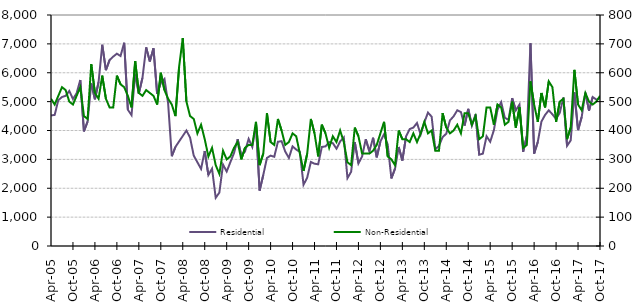
| Category | Residential |
|---|---|
| 2005-04-01 | 4520 |
| 2005-05-01 | 4540 |
| 2005-06-01 | 5050 |
| 2005-07-01 | 5160 |
| 2005-08-01 | 5200 |
| 2005-09-01 | 5370 |
| 2005-10-01 | 5090 |
| 2005-11-01 | 5290 |
| 2005-12-01 | 5750 |
| 2006-01-01 | 3970 |
| 2006-02-01 | 4310 |
| 2006-03-01 | 5630 |
| 2006-04-01 | 5080 |
| 2006-05-01 | 5680 |
| 2006-06-01 | 6970 |
| 2006-07-01 | 6090 |
| 2006-08-01 | 6440 |
| 2006-09-01 | 6560 |
| 2006-10-01 | 6660 |
| 2006-11-01 | 6580 |
| 2006-12-01 | 7040 |
| 2007-01-01 | 4720 |
| 2007-02-01 | 4530 |
| 2007-03-01 | 5940 |
| 2007-04-01 | 5280 |
| 2007-05-01 | 5830 |
| 2007-06-01 | 6880 |
| 2007-07-01 | 6390 |
| 2007-08-01 | 6850 |
| 2007-09-01 | 5270 |
| 2007-10-01 | 5660 |
| 2007-11-01 | 5790 |
| 2007-12-01 | 4940 |
| 2008-01-01 | 3110 |
| 2008-02-01 | 3430 |
| 2008-03-01 | 3620 |
| 2008-04-01 | 3810 |
| 2008-05-01 | 4000 |
| 2008-06-01 | 3750 |
| 2008-07-01 | 3130 |
| 2008-08-01 | 2900 |
| 2008-09-01 | 2670 |
| 2008-10-01 | 3290 |
| 2008-11-01 | 2460 |
| 2008-12-01 | 2680 |
| 2009-01-01 | 1670 |
| 2009-02-01 | 1850 |
| 2009-03-01 | 2820 |
| 2009-04-01 | 2580 |
| 2009-05-01 | 2900 |
| 2009-06-01 | 3220 |
| 2009-07-01 | 3700 |
| 2009-08-01 | 3130 |
| 2009-09-01 | 3270 |
| 2009-10-01 | 3710 |
| 2009-11-01 | 3430 |
| 2009-12-01 | 4210 |
| 2010-01-01 | 1920 |
| 2010-02-01 | 2460 |
| 2010-03-01 | 3050 |
| 2010-04-01 | 3130 |
| 2010-05-01 | 3090 |
| 2010-06-01 | 3610 |
| 2010-07-01 | 3630 |
| 2010-08-01 | 3270 |
| 2010-09-01 | 3050 |
| 2010-10-01 | 3450 |
| 2010-11-01 | 3340 |
| 2010-12-01 | 3260 |
| 2011-01-01 | 2120 |
| 2011-02-01 | 2370 |
| 2011-03-01 | 2910 |
| 2011-04-01 | 2850 |
| 2011-05-01 | 2830 |
| 2011-06-01 | 3430 |
| 2011-07-01 | 3450 |
| 2011-08-01 | 3600 |
| 2011-09-01 | 3560 |
| 2011-10-01 | 3370 |
| 2011-11-01 | 3620 |
| 2011-12-01 | 3760 |
| 2012-01-01 | 2350 |
| 2012-02-01 | 2570 |
| 2012-03-01 | 3600 |
| 2012-04-01 | 2860 |
| 2012-05-01 | 3100 |
| 2012-06-01 | 3700 |
| 2012-07-01 | 3280 |
| 2012-08-01 | 3750 |
| 2012-09-01 | 3070 |
| 2012-10-01 | 3620 |
| 2012-11-01 | 3870 |
| 2012-12-01 | 3510 |
| 2013-01-01 | 2340 |
| 2013-02-01 | 2680 |
| 2013-03-01 | 3430 |
| 2013-04-01 | 2960 |
| 2013-05-01 | 3790 |
| 2013-06-01 | 4050 |
| 2013-07-01 | 4100 |
| 2013-08-01 | 4260 |
| 2013-09-01 | 3860 |
| 2013-10-01 | 4280 |
| 2013-11-01 | 4620 |
| 2013-12-01 | 4480 |
| 2014-01-01 | 3350 |
| 2014-02-01 | 3470 |
| 2014-03-01 | 3770 |
| 2014-04-01 | 3890 |
| 2014-05-01 | 4350 |
| 2014-06-01 | 4490 |
| 2014-07-01 | 4700 |
| 2014-08-01 | 4640 |
| 2014-09-01 | 4170 |
| 2014-10-01 | 4750 |
| 2014-11-01 | 4170 |
| 2014-12-01 | 4560 |
| 2015-01-01 | 3160 |
| 2015-02-01 | 3200 |
| 2015-03-01 | 3800 |
| 2015-04-01 | 3610 |
| 2015-05-01 | 4010 |
| 2015-06-01 | 4720 |
| 2015-07-01 | 4980 |
| 2015-08-01 | 4440 |
| 2015-09-01 | 4370 |
| 2015-10-01 | 5120 |
| 2015-11-01 | 4700 |
| 2015-12-01 | 4900 |
| 2016-01-01 | 3260 |
| 2016-02-01 | 3810 |
| 2016-03-01 | 7020 |
| 2016-04-01 | 3200 |
| 2016-05-01 | 3600 |
| 2016-06-01 | 4310 |
| 2016-07-01 | 4540 |
| 2016-08-01 | 4700 |
| 2016-09-01 | 4560 |
| 2016-10-01 | 4400 |
| 2016-11-01 | 4610 |
| 2016-12-01 | 5140 |
| 2017-01-01 | 3470 |
| 2017-02-01 | 3660 |
| 2017-03-01 | 5320 |
| 2017-04-01 | 4010 |
| 2017-05-01 | 4470 |
| 2017-06-01 | 5310 |
| 2017-07-01 | 4690 |
| 2017-08-01 | 5160 |
| 2017-09-01 | 5070 |
| 2017-10-01 | 5120 |